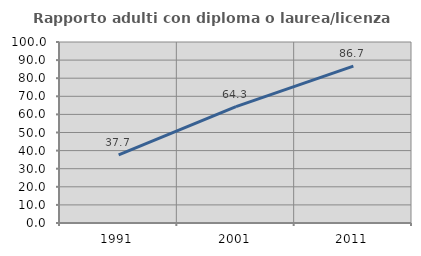
| Category | Rapporto adulti con diploma o laurea/licenza media  |
|---|---|
| 1991.0 | 37.662 |
| 2001.0 | 64.324 |
| 2011.0 | 86.695 |